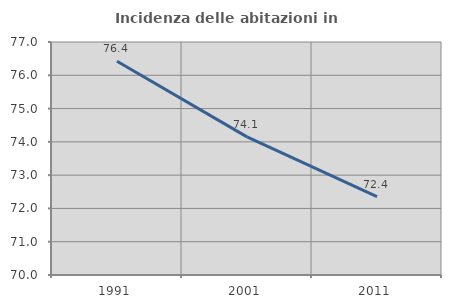
| Category | Incidenza delle abitazioni in proprietà  |
|---|---|
| 1991.0 | 76.419 |
| 2001.0 | 74.149 |
| 2011.0 | 72.356 |